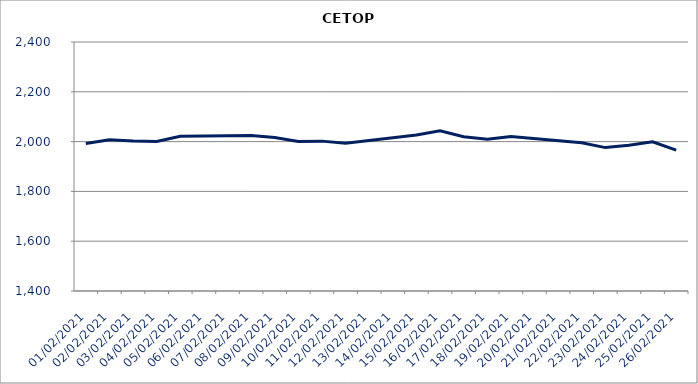
| Category | CETOP |
|---|---|
| 01/02/2021 | 1991.99 |
| 02/02/2021 | 2007.22 |
| 03/02/2021 | 2001.98 |
| 04/02/2021 | 2000.87 |
| 05/02/2021 | 2021.06 |
| 08/02/2021 | 2024.95 |
| 09/02/2021 | 2016.39 |
| 10/02/2021 | 2000.46 |
| 11/02/2021 | 2001.9 |
| 12/02/2021 | 1993.13 |
| 15/02/2021 | 2026.16 |
| 16/02/2021 | 2043.11 |
| 17/02/2021 | 2019.49 |
| 18/02/2021 | 2009.18 |
| 19/02/2021 | 2020.59 |
| 22/02/2021 | 1995 |
| 23/02/2021 | 1975.92 |
| 24/02/2021 | 1985.63 |
| 25/02/2021 | 1998.97 |
| 26/02/2021 | 1965.68 |